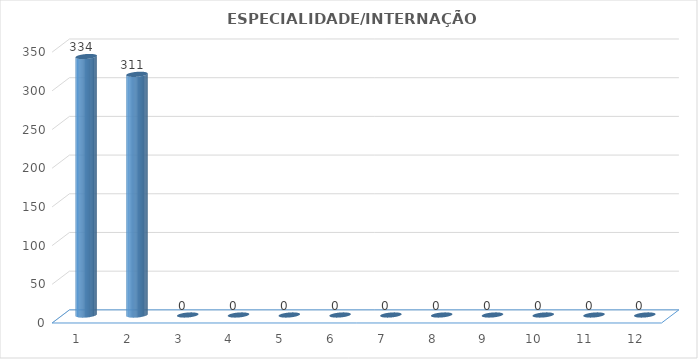
| Category | Series 0 |
|---|---|
| 0 | 334 |
| 1 | 311 |
| 2 | 0 |
| 3 | 0 |
| 4 | 0 |
| 5 | 0 |
| 6 | 0 |
| 7 | 0 |
| 8 | 0 |
| 9 | 0 |
| 10 | 0 |
| 11 | 0 |